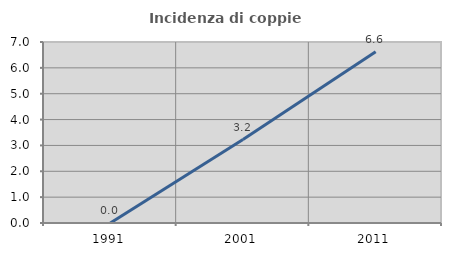
| Category | Incidenza di coppie miste |
|---|---|
| 1991.0 | 0 |
| 2001.0 | 3.226 |
| 2011.0 | 6.623 |